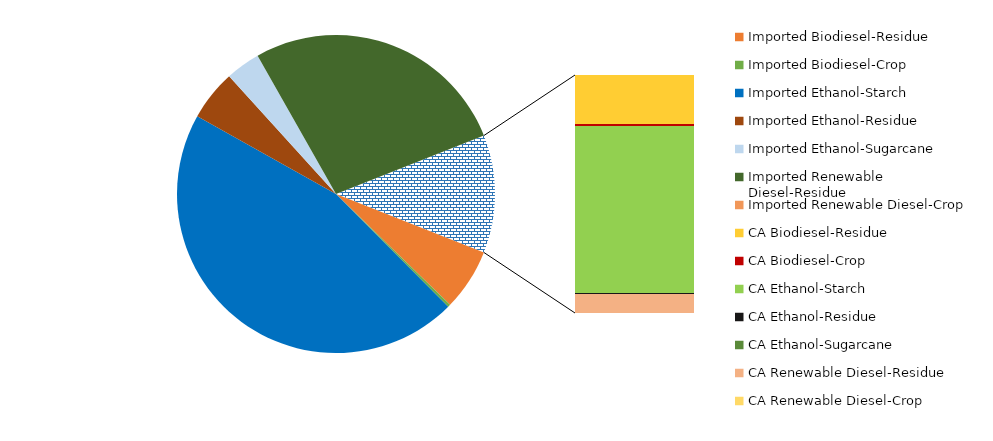
| Category | 2019 |
|---|---|
| Imported Biodiesel-Residue | 109642399 |
| Imported Biodiesel-Crop | 4674957 |
| Imported Ethanol-Starch | 797012880 |
| Imported Ethanol-Residue | 89992034 |
| Imported Ethanol-Sugarcane | 61610823 |
| Imported Renewable Diesel-Residue | 475748494 |
| Imported Renewable Diesel-Crop | 0 |
| CA Biodiesel-Residue | 43133453 |
| CA Biodiesel-Crop | 1845501 |
| CA Ethanol-Starch | 146943280 |
| CA Ethanol-Residue | 791339 |
| CA Ethanol-Sugarcane | 0 |
| CA Renewable Diesel-Residue | 16758079 |
| CA Renewable Diesel-Crop | 0 |